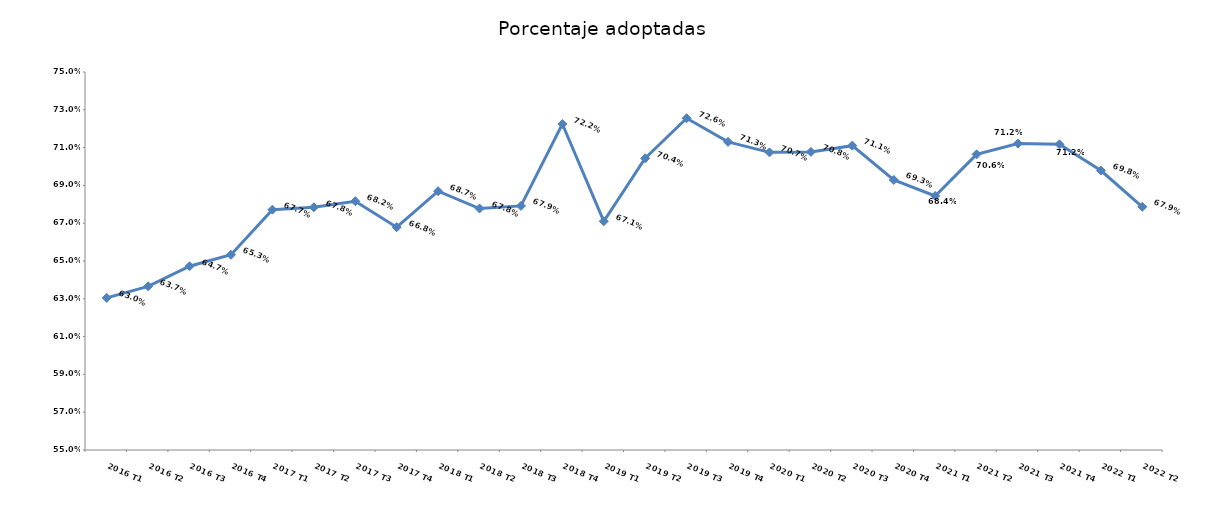
| Category | Porcentaje adoptadas |
|---|---|
| 2016 T1 | 0.63 |
| 2016 T2 | 0.637 |
| 2016 T3 | 0.647 |
| 2016 T4 | 0.653 |
| 2017 T1 | 0.677 |
| 2017 T2 | 0.678 |
| 2017 T3 | 0.682 |
| 2017 T4 | 0.668 |
| 2018 T1 | 0.687 |
| 2018 T2 | 0.678 |
| 2018 T3 | 0.679 |
| 2018 T4 | 0.722 |
| 2019 T1 | 0.671 |
| 2019 T2 | 0.704 |
| 2019 T3 | 0.726 |
| 2019 T4 | 0.713 |
| 2020 T1 | 0.707 |
| 2020 T2 | 0.708 |
| 2020 T3 | 0.711 |
| 2020 T4 | 0.693 |
| 2021 T1 | 0.684 |
| 2021 T2 | 0.706 |
| 2021 T3 | 0.712 |
| 2021 T4 | 0.712 |
| 2022 T1 | 0.698 |
| 2022 T2 | 0.679 |